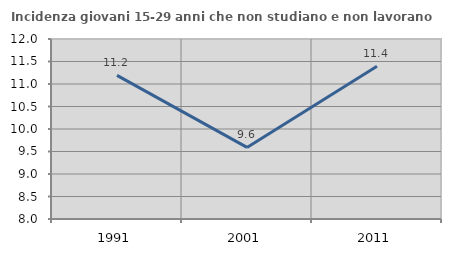
| Category | Incidenza giovani 15-29 anni che non studiano e non lavorano  |
|---|---|
| 1991.0 | 11.191 |
| 2001.0 | 9.591 |
| 2011.0 | 11.396 |